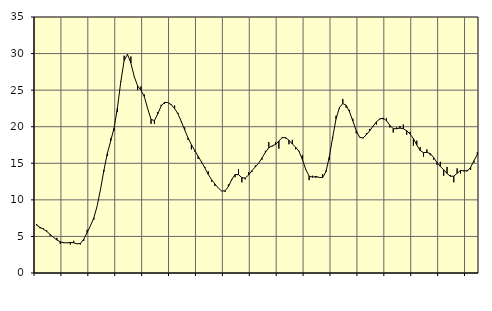
| Category | Piggar | Series 1 |
|---|---|---|
| nan | 6.7 | 6.53 |
| 87.0 | 6.1 | 6.25 |
| 87.0 | 6.1 | 5.99 |
| 87.0 | 5.8 | 5.68 |
| nan | 5.1 | 5.28 |
| 88.0 | 4.9 | 4.87 |
| 88.0 | 4.8 | 4.51 |
| 88.0 | 4 | 4.28 |
| nan | 4.2 | 4.14 |
| 89.0 | 4.1 | 4.12 |
| 89.0 | 3.9 | 4.17 |
| 89.0 | 4.4 | 4.13 |
| nan | 4 | 3.98 |
| 90.0 | 3.9 | 4.04 |
| 90.0 | 4.4 | 4.62 |
| 90.0 | 5.9 | 5.52 |
| nan | 6.5 | 6.47 |
| 91.0 | 7.3 | 7.55 |
| 91.0 | 9.2 | 9.2 |
| 91.0 | 11.5 | 11.5 |
| nan | 13.9 | 14.08 |
| 92.0 | 16 | 16.33 |
| 92.0 | 18.4 | 18.05 |
| 92.0 | 19.4 | 19.8 |
| nan | 22 | 22.57 |
| 93.0 | 26.2 | 26.13 |
| 93.0 | 29.7 | 29.04 |
| 93.0 | 29.8 | 29.9 |
| nan | 29.6 | 28.7 |
| 94.0 | 26.9 | 26.86 |
| 94.0 | 25 | 25.59 |
| 94.0 | 25.5 | 24.99 |
| nan | 24.4 | 24.13 |
| 95.0 | 22.5 | 22.48 |
| 95.0 | 20.4 | 21.01 |
| 95.0 | 20.4 | 20.83 |
| nan | 22 | 21.77 |
| 96.0 | 23 | 22.83 |
| 96.0 | 23.1 | 23.32 |
| 96.0 | 23.3 | 23.3 |
| nan | 23.1 | 23.01 |
| 97.0 | 22.9 | 22.49 |
| 97.0 | 21.9 | 21.75 |
| 97.0 | 20.6 | 20.71 |
| nan | 19.9 | 19.56 |
| 98.0 | 18.2 | 18.48 |
| 98.0 | 16.9 | 17.53 |
| 98.0 | 16.6 | 16.75 |
| nan | 15.6 | 15.95 |
| 99.0 | 15.1 | 15.19 |
| 99.0 | 14.5 | 14.36 |
| 99.0 | 13.9 | 13.49 |
| nan | 12.5 | 12.75 |
| 0.0 | 11.9 | 12.16 |
| 0.0 | 11.6 | 11.61 |
| 0.0 | 11.2 | 11.21 |
| nan | 11.1 | 11.23 |
| 1.0 | 12.1 | 11.82 |
| 1.0 | 12.7 | 12.79 |
| 1.0 | 13.1 | 13.46 |
| nan | 14.2 | 13.44 |
| 2.0 | 12.4 | 13.04 |
| 2.0 | 12.8 | 12.98 |
| 2.0 | 13.8 | 13.39 |
| nan | 13.8 | 14 |
| 3.0 | 14.7 | 14.5 |
| 3.0 | 15 | 15.02 |
| 3.0 | 15.5 | 15.74 |
| nan | 16.7 | 16.5 |
| 4.0 | 17.9 | 17.13 |
| 4.0 | 17.3 | 17.38 |
| 4.0 | 17.9 | 17.57 |
| nan | 17 | 18.06 |
| 5.0 | 18.6 | 18.5 |
| 5.0 | 18.4 | 18.51 |
| 5.0 | 17.6 | 18.15 |
| nan | 18.2 | 17.63 |
| 6.0 | 16.9 | 17.2 |
| 6.0 | 16.7 | 16.62 |
| 6.0 | 16.1 | 15.51 |
| nan | 14.2 | 14.15 |
| 7.0 | 12.7 | 13.24 |
| 7.0 | 13.3 | 13.1 |
| 7.0 | 13 | 13.2 |
| nan | 13.1 | 13.07 |
| 8.0 | 13.5 | 13.05 |
| 8.0 | 14 | 13.85 |
| 8.0 | 15.5 | 15.88 |
| nan | 18.4 | 18.55 |
| 9.0 | 21.5 | 21.07 |
| 9.0 | 22.5 | 22.61 |
| 9.0 | 23.8 | 23.17 |
| nan | 22.6 | 22.94 |
| 10.0 | 22.3 | 22.05 |
| 10.0 | 21.1 | 20.77 |
| 10.0 | 19.1 | 19.46 |
| nan | 18.6 | 18.57 |
| 11.0 | 18.4 | 18.45 |
| 11.0 | 19.1 | 18.89 |
| 11.0 | 19.7 | 19.44 |
| nan | 20 | 20.06 |
| 12.0 | 20.3 | 20.67 |
| 12.0 | 21 | 21.07 |
| 12.0 | 21 | 21.17 |
| nan | 21.2 | 20.82 |
| 13.0 | 19.9 | 20.19 |
| 13.0 | 19.2 | 19.73 |
| 13.0 | 19.9 | 19.73 |
| nan | 20.1 | 19.81 |
| 14.0 | 20.3 | 19.72 |
| 14.0 | 18.9 | 19.45 |
| 14.0 | 19.3 | 19.01 |
| nan | 17.4 | 18.37 |
| 15.0 | 18.1 | 17.49 |
| 15.0 | 17.2 | 16.75 |
| 15.0 | 15.9 | 16.45 |
| nan | 16.9 | 16.49 |
| 16.0 | 16.1 | 16.33 |
| 16.0 | 15.5 | 15.79 |
| 16.0 | 14.8 | 15.12 |
| nan | 15.2 | 14.57 |
| 17.0 | 13.3 | 14.11 |
| 17.0 | 14.5 | 13.6 |
| 17.0 | 13.4 | 13.22 |
| nan | 12.4 | 13.24 |
| 18.0 | 14.3 | 13.63 |
| 18.0 | 13.6 | 14.02 |
| 18.0 | 13.9 | 13.99 |
| nan | 14.1 | 13.93 |
| 19.0 | 14.1 | 14.44 |
| 19.0 | 15.1 | 15.35 |
| 19.0 | 16.5 | 16.19 |